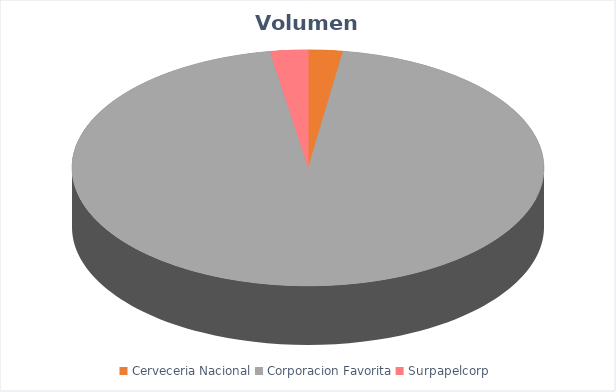
| Category | VOLUMEN ($USD) |
|---|---|
| Cerveceria Nacional | 425 |
| Corporacion Favorita | 17191.2 |
| Surpapelcorp | 467.5 |